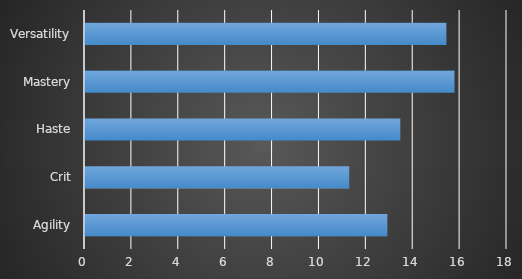
| Category | Series 0 |
|---|---|
| Agility | 12.897 |
| Crit | 11.269 |
| Haste | 13.449 |
| Mastery | 15.76 |
| Versatility | 15.415 |